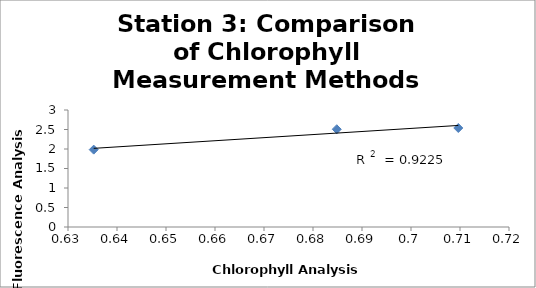
| Category | Series 0 |
|---|---|
| 0.6352462905186493 | 1.984 |
| 0.6848499051435313 | 2.507 |
| 0.7096517124559723 | 2.539 |